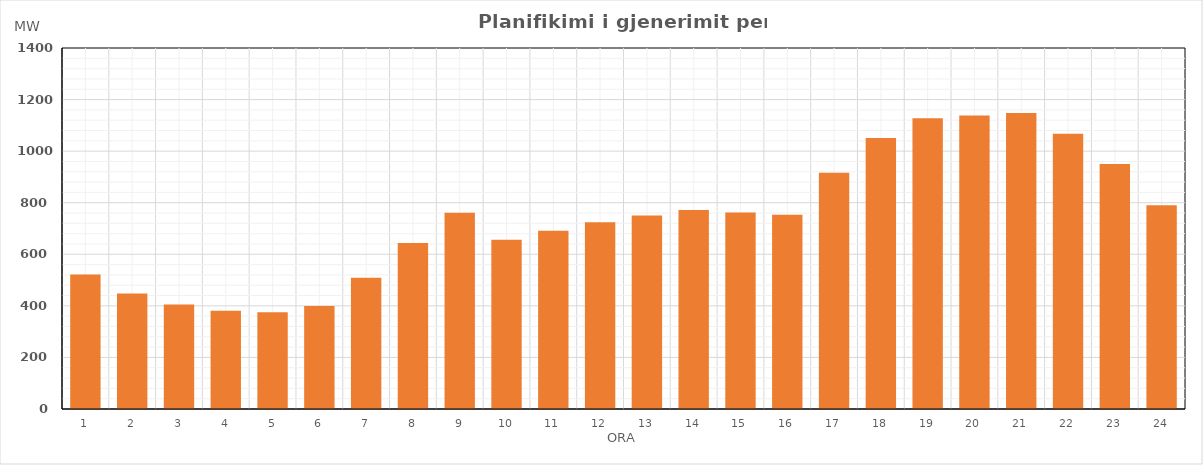
| Category | Max (MW) |
|---|---|
| 0 | 521.16 |
| 1 | 447.83 |
| 2 | 405.1 |
| 3 | 381.31 |
| 4 | 375.09 |
| 5 | 399.57 |
| 6 | 508.79 |
| 7 | 644.22 |
| 8 | 760.92 |
| 9 | 655.92 |
| 10 | 690.86 |
| 11 | 724.65 |
| 12 | 749.94 |
| 13 | 771.52 |
| 14 | 762.04 |
| 15 | 752.89 |
| 16 | 916.3 |
| 17 | 1050.84 |
| 18 | 1127.64 |
| 19 | 1138.32 |
| 20 | 1148.05 |
| 21 | 1067.35 |
| 22 | 950.35 |
| 23 | 790.45 |